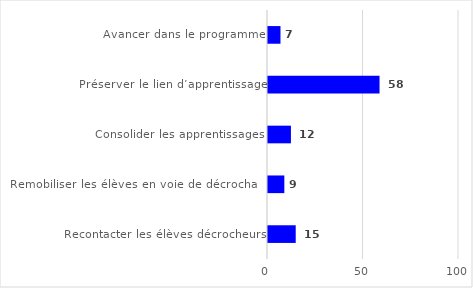
| Category | Series 0 |
|---|---|
| Avancer dans le programme | 6.54 |
| Préserver le lien d’apprentissage | 58.393 |
| Consolider les apprentissages | 12.005 |
| Remobiliser les élèves en voie de décrochage | 8.548 |
| Recontacter les élèves décrocheurs | 14.513 |